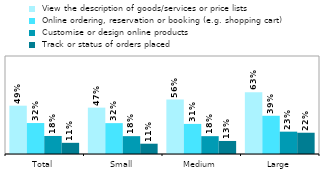
| Category |  View the description of goods/services or price lists |  Online ordering, reservation or booking (e.g. shopping cart) |  Customise or design online products |  Track or status of orders placed |
|---|---|---|---|---|
| Total | 0.493 | 0.316 | 0.184 | 0.114 |
| Small | 0.473 | 0.315 | 0.182 | 0.105 |
| Medium | 0.556 | 0.307 | 0.182 | 0.133 |
| Large | 0.63 | 0.39 | 0.228 | 0.217 |